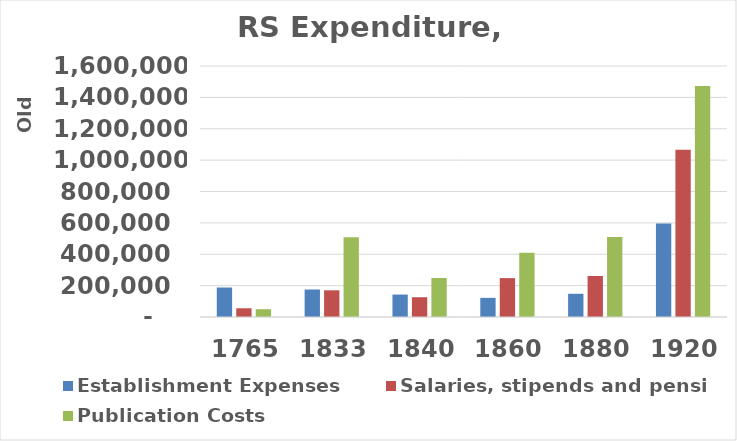
| Category | Establishment Expenses | Salaries, stipends and pensions | Publication Costs |
|---|---|---|---|
| 1765.0 | 188131 | 55680 | 49796 |
| 1833.0 | 175237.5 | 170124 | 508319 |
| 1840.0 | 143107 | 126060 | 248676 |
| 1860.0 | 121995 | 247920 | 410136 |
| 1880.0 | 148023 | 261501 | 509215 |
| 1920.0 | 596735 | 1065815 | 1472169 |